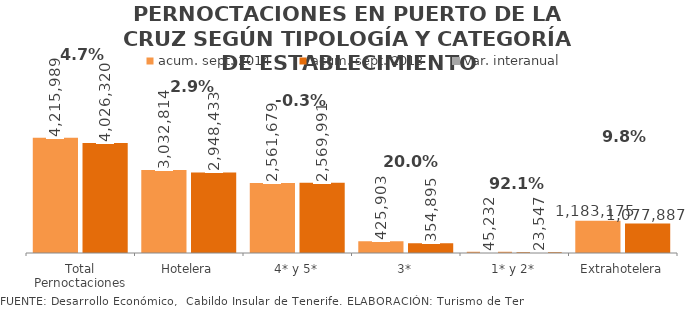
| Category | acum. sept. 2014 | acum. sept. 2013 |
|---|---|---|
| Total Pernoctaciones | 4215989 | 4026320 |
| Hotelera | 3032814 | 2948433 |
| 4* y 5* | 2561679 | 2569991 |
| 3* | 425903 | 354895 |
| 1* y 2* | 45232 | 23547 |
| Extrahotelera | 1183175 | 1077887 |